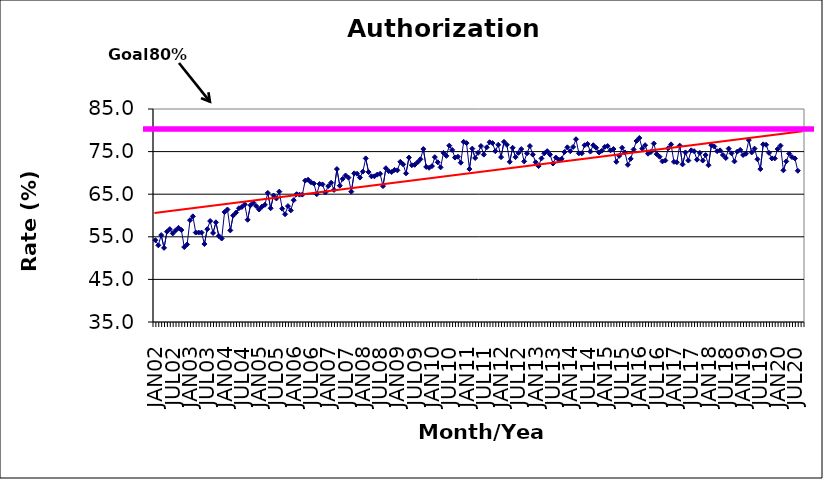
| Category | Series 0 |
|---|---|
| JAN02 | 54.2 |
| FEB02 | 53 |
| MAR02 | 55.4 |
| APR02 | 52.4 |
| MAY02 | 56.2 |
| JUN02 | 56.8 |
| JUL02 | 55.8 |
| AUG02 | 56.5 |
| SEP02 | 57.1 |
| OCT02 | 56.6 |
| NOV02 | 52.6 |
| DEC02 | 53.2 |
| JAN03 | 58.9 |
| FEB03 | 59.8 |
| MAR03 | 56 |
| APR03 | 56 |
| MAY03 | 56 |
| JUN03 | 53.3 |
| JUL03 | 56.8 |
| AUG03 | 58.7 |
| SEP03 | 55.9 |
| OCT03 | 58.4 |
| NOV03 | 55.2 |
| DEC03 | 54.6 |
| JAN04 | 60.8 |
| FEB04 | 61.4 |
| MAR04 | 56.5 |
| APR04 | 60 |
| MAY04 | 60.7 |
| JUN04 | 61.7 |
| JUL04 | 62 |
| AUG04 | 62.6 |
| SEP04 | 59 |
| OCT04 | 62.4 |
| NOV04 | 63 |
| DEC04 | 62.2 |
| JAN05 | 61.4 |
| FEB05 | 62.1 |
| MAR05 | 62.5 |
| APR05 | 65.3 |
| MAY05 | 61.7 |
| JUN05 | 64.7 |
| JUL05 | 64 |
| AUG05 | 65.6 |
| SEP05 | 61.6 |
| OCT05 | 60.3 |
| NOV05 | 62.2 |
| DEC05 | 61.2 |
| JAN06 | 63.6 |
| FEB06 | 65 |
| MAR06 | 64.9 |
| APR06 | 64.9 |
| MAY06 | 68.2 |
| JUN06 | 68.4 |
| JUL06 | 67.8 |
| AUG06 | 67.5 |
| SEP06 | 65 |
| OCT06 | 67.4 |
| NOV06 | 67.3 |
| DEC06 | 65.4 |
| JAN07 | 66.9 |
| FEB07 | 67.7 |
| MAR07 | 66 |
| APR07 | 70.9 |
| MAY07 | 67 |
| JUN07 | 68.6 |
| JUL07 | 69.4 |
| AUG07 | 68.9 |
| SEP07 | 65.6 |
| OCT07 | 69.9 |
| NOV07 | 69.8 |
| DEC07 | 68.9 |
| JAN08 | 70.3 |
| FEB08 | 73.4 |
| MAR08 | 70.2 |
| APR08 | 69.2 |
| MAY08 | 69.2 |
| JUN08 | 69.6 |
| JUL08 | 69.8 |
| AUG08 | 66.9 |
| SEP08 | 71.1 |
| OCT08 | 70.4 |
| NOV08 | 70.2 |
| DEC08 | 70.7 |
| JAN09 | 70.6 |
| FEB09 | 72.6 |
| MAR09 | 72 |
| APR09 | 69.9 |
| MAY09 | 73.6 |
| JUN09 | 71.8 |
| JUL09 | 71.9 |
| AUG09 | 72.5 |
| SEP09 | 73.2 |
| OCT09 | 75.6 |
| NOV09 | 71.4 |
| DEC09 | 71.2 |
| JAN10 | 71.6 |
| FEB10 | 73.7 |
| MAR10 | 72.5 |
| APR10 | 71.3 |
| MAY10 | 74.7 |
| JUN10 | 74 |
| JUL10 | 76.4 |
| AUG10 | 75.4 |
| SEP10 | 73.6 |
| OCT10 | 73.8 |
| NOV10 | 72.4 |
| DEC10 | 77.3 |
| JAN11 | 77 |
| FEB11 | 70.9 |
| MAR11 | 75.7 |
| APR11 | 73.5 |
| MAY11 | 74.7 |
| JUN11 | 76.3 |
| JUL11 | 74.3 |
| AUG11 | 76 |
| SEP11 | 77.2 |
| OCT11 | 77 |
| NOV11 | 75.1 |
| DEC11 | 76.6 |
| JAN12 | 73.7 |
| FEB12 | 77.3 |
| MAR12 | 76.6 |
| APR12 | 72.6 |
| MAY12 | 75.9 |
| JUN12 | 73.7 |
| JUL12 | 74.7 |
| AUG12 | 75.6 |
| SEP12 | 72.7 |
| OCT12 | 74.6 |
| NOV12 | 76.3 |
| DEC12 | 74.3 |
| JAN13 | 72.5 |
| FEB13 | 71.6 |
| MAR13 | 73.4 |
| APR13 | 74.6 |
| MAY13 | 75.1 |
| JUN13 | 74.3 |
| JUL13 | 72.2 |
| AUG13 | 73.6 |
| SEP13 | 73.1 |
| OCT13 | 73.3 |
| NOV13 | 74.9 |
| DEC13 | 76 |
| JAN14 | 75.1 |
| FEB14 | 76.1 |
| MAR14 | 77.9 |
| APR14 | 74.6 |
| MAY14 | 74.6 |
| JUN14 | 76.5 |
| JUL14 | 76.8 |
| AUG14 | 75 |
| SEP14 | 76.5 |
| OCT14 | 75.9 |
| NOV14 | 74.8 |
| DEC14 | 75.2 |
| JAN15 | 76.1 |
| FEB15 | 76.3 |
| MAR15 | 75.3 |
| APR15 | 75.6 |
| MAY15 | 72.6 |
| JUN15 | 74 |
| JUL15 | 75.9 |
| AUG15 | 74.8 |
| SEP15 | 71.9 |
| OCT15 | 73.3 |
| NOV15 | 75.5 |
| DEC15 | 77.5 |
| JAN16 | 78.2 |
| FEB16 | 75.7 |
| MAR16 | 76.5 |
| APR16 | 74.5 |
| MAY16 | 74.9 |
| JUN16 | 76.9 |
| JUL16 | 74.4 |
| AUG16 | 73.8 |
| SEP16 | 72.7 |
| OCT16 | 72.9 |
| NOV16 | 75.8 |
| DEC16 | 76.7 |
| JAN17 | 72.6 |
| FEB17 | 72.5 |
| MAR17 | 76.4 |
| APR17 | 72 |
| MAY17 | 74.8 |
| JUN17 | 72.9 |
| JUL17 | 75.3 |
| AUG17 | 75.1 |
| SEP17 | 73.1 |
| OCT17 | 74.7 |
| NOV17 | 72.9 |
| DEC17 | 74.2 |
| JAN18 | 71.8 |
| FEB18 | 76.5 |
| MAR18 | 76.2 |
| APR18 | 75.1 |
| MAY18 | 75.3 |
| JUN18 | 74.2 |
| JUL18 | 73.5 |
| AUG18 | 75.7 |
| SEP18 | 74.6 |
| OCT18 | 72.7 |
| NOV18 | 75 |
| DEC18 | 75.4 |
| JAN19 | 74.2 |
| FEB19 | 74.5 |
| MAR19 | 77.7 |
| APR19 | 74.8 |
| MAY19 | 75.7 |
| JUN19 | 73.2 |
| JUL19 | 70.9 |
| AUG19 | 76.7 |
| SEP19 | 76.6 |
| OCT19 | 74.7 |
| NOV19 | 73.4 |
| DEC19 | 73.4 |
| JAN20 | 75.6 |
| FEB20 | 76.4 |
| MAR20 | 70.6 |
| APR20 | 72.7 |
| MAY20 | 74.5 |
| JUN20 | 73.7 |
| JUL20 | 73.4 |
| AUG20 | 70.5 |